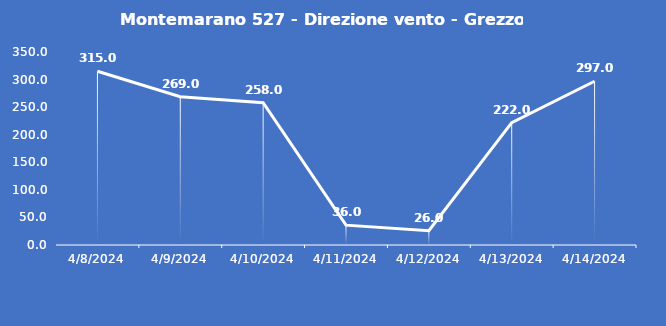
| Category | Montemarano 527 - Direzione vento - Grezzo (°N) |
|---|---|
| 4/8/24 | 315 |
| 4/9/24 | 269 |
| 4/10/24 | 258 |
| 4/11/24 | 36 |
| 4/12/24 | 26 |
| 4/13/24 | 222 |
| 4/14/24 | 297 |